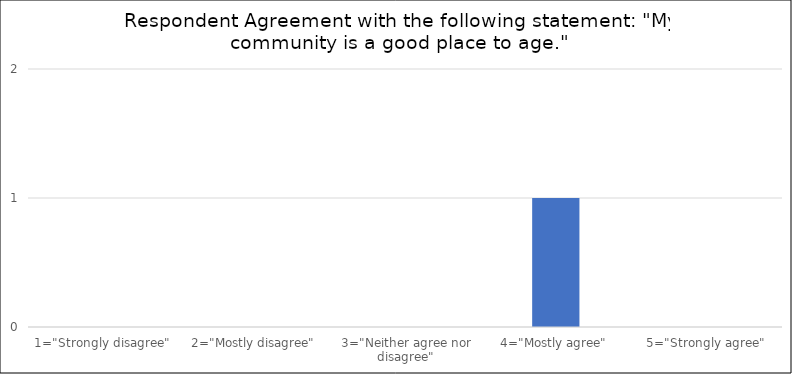
| Category | Number of Responses |
|---|---|
| 1="Strongly disagree" | 0 |
| 2="Mostly disagree" | 0 |
| 3="Neither agree nor disagree" | 0 |
| 4="Mostly agree" | 1 |
| 5="Strongly agree" | 0 |